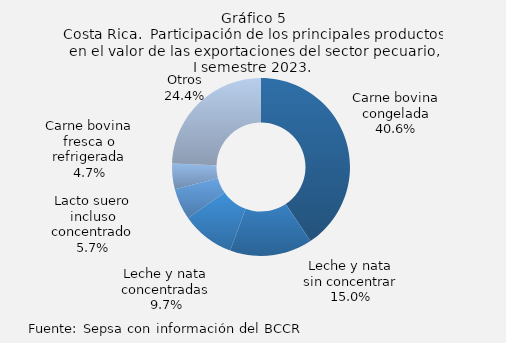
| Category | Series 0 |
|---|---|
| Carne bovina congelada | 40.634 |
| Leche y nata sin concentrar | 14.987 |
| Leche y nata concentradas | 9.677 |
| Lacto suero incluso concentrado | 5.668 |
| Carne bovina fresca o refrigerada | 4.678 |
| Otros | 24.356 |